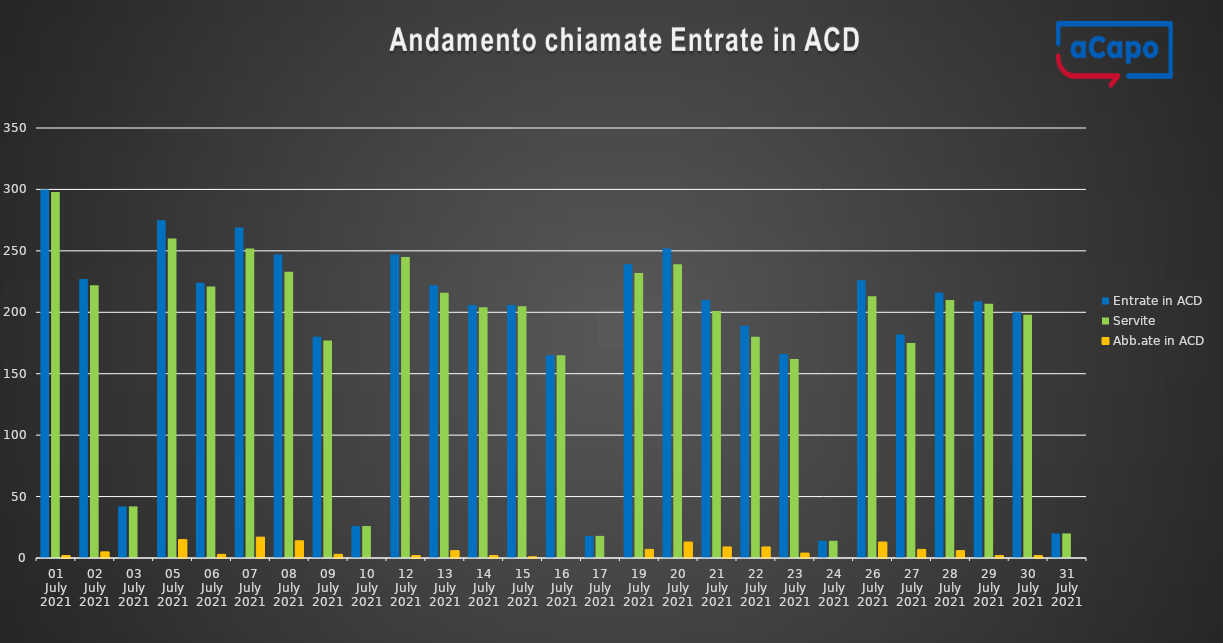
| Category | Entrate in ACD | Servite | Abb.ate in ACD |
|---|---|---|---|
| 2021-07-01 | 300 | 298 | 2 |
| 2021-07-02 | 227 | 222 | 5 |
| 2021-07-03 | 42 | 42 | 0 |
| 2021-07-05 | 275 | 260 | 15 |
| 2021-07-06 | 224 | 221 | 3 |
| 2021-07-07 | 269 | 252 | 17 |
| 2021-07-08 | 247 | 233 | 14 |
| 2021-07-09 | 180 | 177 | 3 |
| 2021-07-10 | 26 | 26 | 0 |
| 2021-07-12 | 247 | 245 | 2 |
| 2021-07-13 | 222 | 216 | 6 |
| 2021-07-14 | 206 | 204 | 2 |
| 2021-07-15 | 206 | 205 | 1 |
| 2021-07-16 | 165 | 165 | 0 |
| 2021-07-17 | 18 | 18 | 0 |
| 2021-07-19 | 239 | 232 | 7 |
| 2021-07-20 | 252 | 239 | 13 |
| 2021-07-21 | 210 | 201 | 9 |
| 2021-07-22 | 189 | 180 | 9 |
| 2021-07-23 | 166 | 162 | 4 |
| 2021-07-24 | 14 | 14 | 0 |
| 2021-07-26 | 226 | 213 | 13 |
| 2021-07-27 | 182 | 175 | 7 |
| 2021-07-28 | 216 | 210 | 6 |
| 2021-07-29 | 209 | 207 | 2 |
| 2021-07-30 | 200 | 198 | 2 |
| 2021-07-31 | 20 | 20 | 0 |